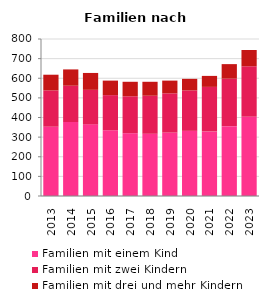
| Category | Familien mit einem Kind | Familien mit zwei Kindern | Familien mit drei und mehr Kindern |
|---|---|---|---|
| 2013.0 | 353 | 185 | 80 |
| 2014.0 | 377 | 185 | 83 |
| 2015.0 | 365 | 176 | 86 |
| 2016.0 | 335 | 179 | 74 |
| 2017.0 | 320 | 188 | 74 |
| 2018.0 | 317 | 194 | 71 |
| 2019.0 | 323 | 200 | 65 |
| 2020.0 | 332 | 206 | 59 |
| 2021.0 | 329 | 227 | 56 |
| 2022.0 | 356 | 242 | 74 |
| 2023.0 | 404 | 257 | 83 |